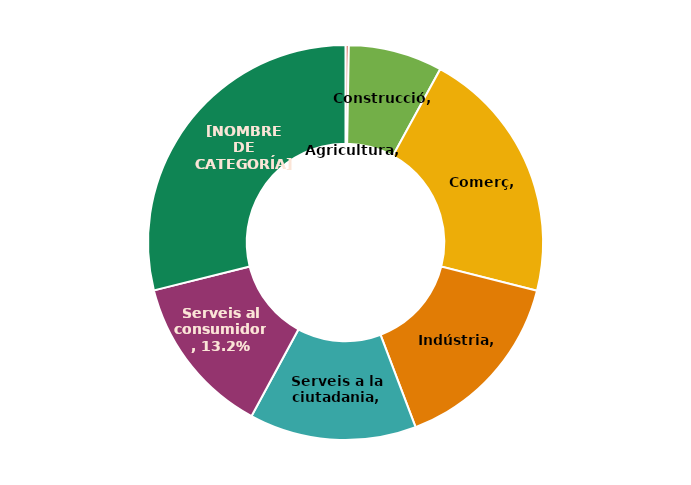
| Category | Series 0 |
|---|---|
| Agricultura | 0.003 |
| Construcció | 0.077 |
| Comerç | 0.21 |
| Indústria | 0.153 |
| Serveis a la ciutadania | 0.137 |
| Serveis al consumidor | 0.132 |
| Serveis relacionats amb l'empresa | 0.289 |